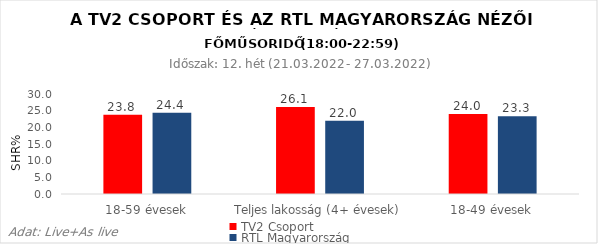
| Category | TV2 Csoport | RTL Magyarország |
|---|---|---|
| 18-59 évesek | 23.8 | 24.4 |
| Teljes lakosság (4+ évesek) | 26.1 | 22 |
| 18-49 évesek | 24 | 23.3 |